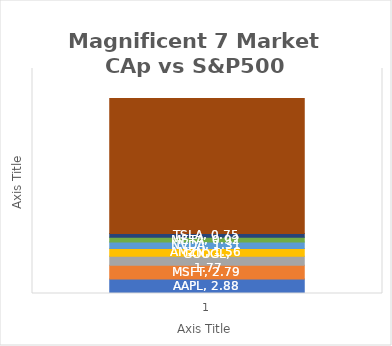
| Category | AAPL | MSFT | GOOGL | AMZN | NVDA | META | TSLA | S&P500 |
|---|---|---|---|---|---|---|---|---|
| 0 | 2.879 | 2.793 | 1.773 | 1.564 | 1.313 | 0.919 | 0.747 | 27.012 |